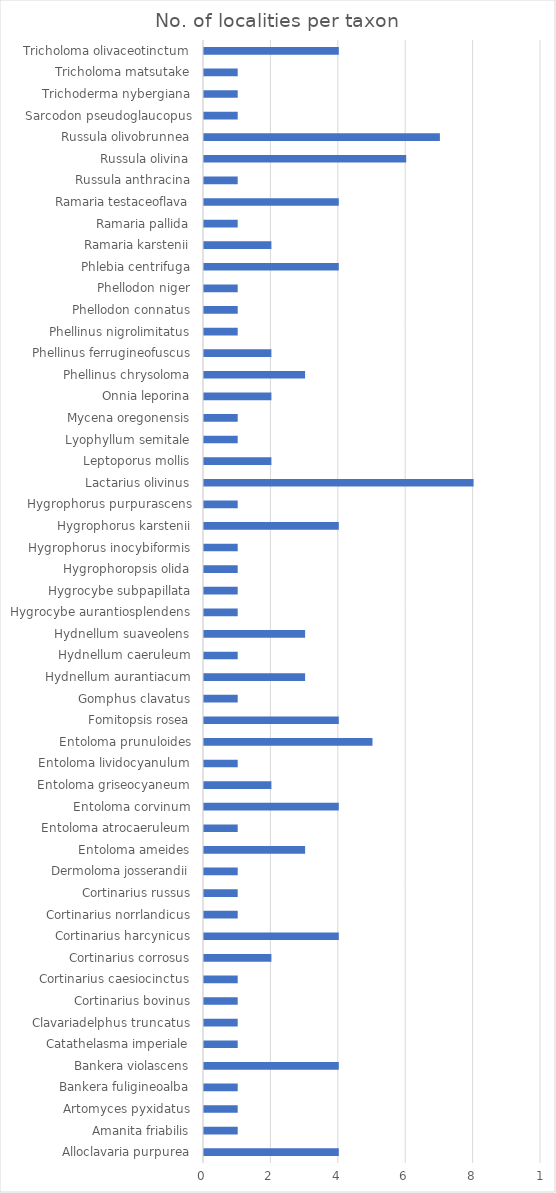
| Category | Series 0 |
|---|---|
| Alloclavaria purpurea | 4 |
| Amanita friabilis | 1 |
| Artomyces pyxidatus | 1 |
| Bankera fuligineoalba | 1 |
| Bankera violascens | 4 |
| Catathelasma imperiale | 1 |
| Clavariadelphus truncatus | 1 |
| Cortinarius bovinus | 1 |
| Cortinarius caesiocinctus | 1 |
| Cortinarius corrosus | 2 |
| Cortinarius harcynicus | 4 |
| Cortinarius norrlandicus | 1 |
| Cortinarius russus | 1 |
| Dermoloma josserandii | 1 |
| Entoloma ameides | 3 |
| Entoloma atrocaeruleum | 1 |
| Entoloma corvinum | 4 |
| Entoloma griseocyaneum | 2 |
| Entoloma lividocyanulum | 1 |
| Entoloma prunuloides | 5 |
| Fomitopsis rosea | 4 |
| Gomphus clavatus | 1 |
| Hydnellum aurantiacum | 3 |
| Hydnellum caeruleum | 1 |
| Hydnellum suaveolens | 3 |
| Hygrocybe aurantiosplendens | 1 |
| Hygrocybe subpapillata | 1 |
| Hygrophoropsis olida | 1 |
| Hygrophorus inocybiformis | 1 |
| Hygrophorus karstenii | 4 |
| Hygrophorus purpurascens | 1 |
| Lactarius olivinus | 8 |
| Leptoporus mollis | 2 |
| Lyophyllum semitale | 1 |
| Mycena oregonensis | 1 |
| Onnia leporina | 2 |
| Phellinus chrysoloma | 3 |
| Phellinus ferrugineofuscus | 2 |
| Phellinus nigrolimitatus | 1 |
| Phellodon connatus | 1 |
| Phellodon niger | 1 |
| Phlebia centrifuga | 4 |
| Ramaria karstenii | 2 |
| Ramaria pallida | 1 |
| Ramaria testaceoflava | 4 |
| Russula anthracina | 1 |
| Russula olivina | 6 |
| Russula olivobrunnea | 7 |
| Sarcodon pseudoglaucopus | 1 |
| Trichoderma nybergiana | 1 |
| Tricholoma matsutake | 1 |
| Tricholoma olivaceotinctum | 4 |